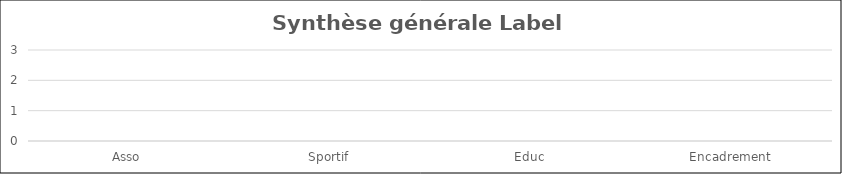
| Category | Series 0 |
|---|---|
| Asso | 0 |
| Sportif | 0 |
| Educ | 0 |
| Encadrement | 0 |